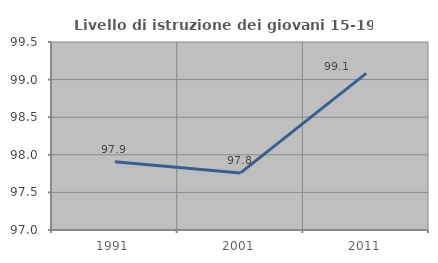
| Category | Livello di istruzione dei giovani 15-19 anni |
|---|---|
| 1991.0 | 97.908 |
| 2001.0 | 97.759 |
| 2011.0 | 99.083 |